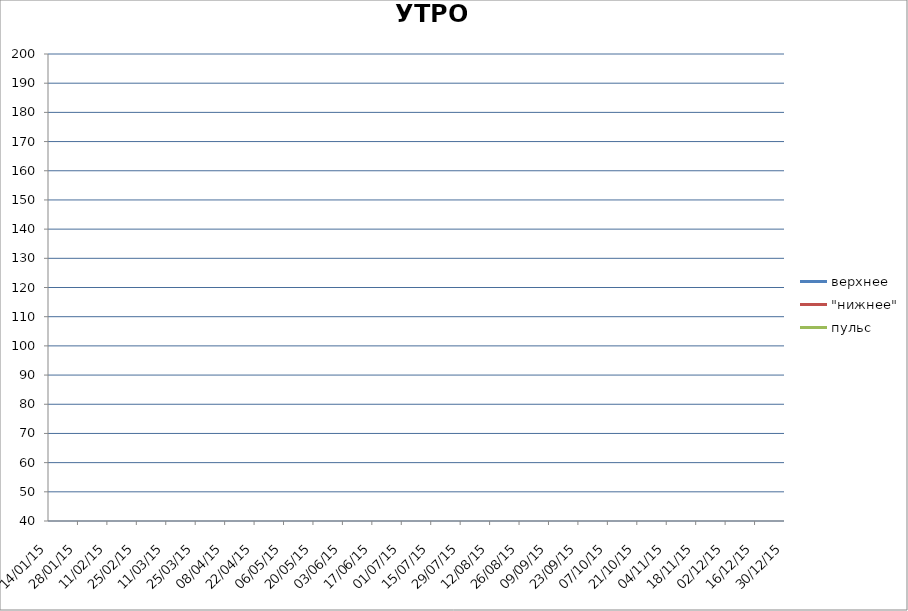
| Category | верхнее | "нижнее" | пульс |
|---|---|---|---|
| 2015-01-14 | 0 | 0 | 0 |
| 2015-01-28 | 0 | 0 | 0 |
| 2015-02-11 | 0 | 0 | 0 |
| 2015-02-25 | 0 | 0 | 0 |
| 2015-03-11 | 0 | 0 | 0 |
| 2015-03-25 | 0 | 0 | 0 |
| 2015-04-08 | 0 | 0 | 0 |
| 2015-04-22 | 0 | 0 | 0 |
| 2015-05-06 | 0 | 0 | 0 |
| 2015-05-20 | 0 | 0 | 0 |
| 2015-06-03 | 0 | 0 | 0 |
| 2015-06-17 | 0 | 0 | 0 |
| 2015-07-01 | 0 | 0 | 0 |
| 2015-07-15 | 0 | 0 | 0 |
| 2015-07-29 | 0 | 0 | 0 |
| 2015-08-12 | 0 | 0 | 0 |
| 2015-08-26 | 0 | 0 | 0 |
| 2015-09-09 | 0 | 0 | 0 |
| 2015-09-23 | 0 | 0 | 0 |
| 2015-10-07 | 0 | 0 | 0 |
| 2015-10-21 | 0 | 0 | 0 |
| 2015-11-04 | 0 | 0 | 0 |
| 2015-11-18 | 0 | 0 | 0 |
| 2015-12-02 | 0 | 0 | 0 |
| 2015-12-16 | 0 | 0 | 0 |
| 2015-12-30 | 0 | 0 | 0 |